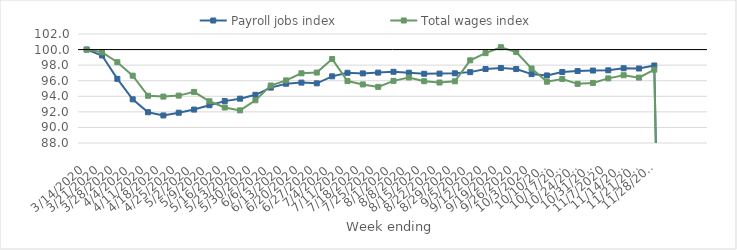
| Category | Payroll jobs index | Total wages index |
|---|---|---|
| 14/03/2020 | 100 | 100 |
| 21/03/2020 | 99.244 | 99.654 |
| 28/03/2020 | 96.24 | 98.376 |
| 04/04/2020 | 93.611 | 96.647 |
| 11/04/2020 | 91.951 | 94.065 |
| 18/04/2020 | 91.54 | 93.96 |
| 25/04/2020 | 91.89 | 94.086 |
| 02/05/2020 | 92.294 | 94.563 |
| 09/05/2020 | 92.851 | 93.362 |
| 16/05/2020 | 93.38 | 92.559 |
| 23/05/2020 | 93.691 | 92.191 |
| 30/05/2020 | 94.189 | 93.489 |
| 06/06/2020 | 95.112 | 95.384 |
| 13/06/2020 | 95.61 | 96.041 |
| 20/06/2020 | 95.758 | 96.951 |
| 27/06/2020 | 95.662 | 97.048 |
| 04/07/2020 | 96.562 | 98.782 |
| 11/07/2020 | 97.02 | 95.951 |
| 18/07/2020 | 96.939 | 95.522 |
| 25/07/2020 | 97.042 | 95.21 |
| 01/08/2020 | 97.145 | 95.98 |
| 08/08/2020 | 97.028 | 96.418 |
| 15/08/2020 | 96.891 | 95.936 |
| 22/08/2020 | 96.912 | 95.768 |
| 29/08/2020 | 96.951 | 95.924 |
| 05/09/2020 | 97.102 | 98.618 |
| 12/09/2020 | 97.5 | 99.542 |
| 19/09/2020 | 97.636 | 100.304 |
| 26/09/2020 | 97.498 | 99.685 |
| 03/10/2020 | 96.847 | 97.575 |
| 10/10/2020 | 96.677 | 95.876 |
| 17/10/2020 | 97.124 | 96.224 |
| 24/10/2020 | 97.241 | 95.599 |
| 31/10/2020 | 97.306 | 95.715 |
| 07/11/2020 | 97.335 | 96.299 |
| 14/11/2020 | 97.6 | 96.705 |
| 21/11/2020 | 97.567 | 96.396 |
| 28/11/2020 | 97.955 | 97.416 |